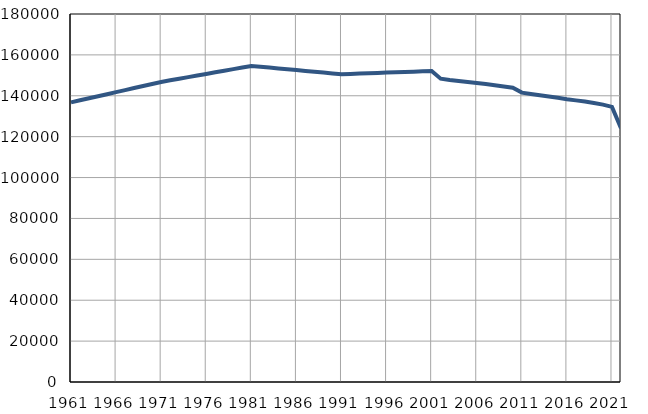
| Category | Population
size |
|---|---|
| 1961.0 | 136782 |
| 1962.0 | 137781 |
| 1963.0 | 138780 |
| 1964.0 | 139778 |
| 1965.0 | 140777 |
| 1966.0 | 141776 |
| 1967.0 | 142775 |
| 1968.0 | 143774 |
| 1969.0 | 144772 |
| 1970.0 | 145771 |
| 1971.0 | 146770 |
| 1972.0 | 147554 |
| 1973.0 | 148338 |
| 1974.0 | 149122 |
| 1975.0 | 149906 |
| 1976.0 | 150690 |
| 1977.0 | 151475 |
| 1978.0 | 152259 |
| 1979.0 | 153043 |
| 1980.0 | 153827 |
| 1981.0 | 154611 |
| 1982.0 | 154204 |
| 1983.0 | 153795 |
| 1984.0 | 153388 |
| 1985.0 | 152980 |
| 1986.0 | 152572 |
| 1987.0 | 152165 |
| 1988.0 | 151757 |
| 1989.0 | 151349 |
| 1990.0 | 150941 |
| 1991.0 | 150534 |
| 1992.0 | 150693 |
| 1993.0 | 150851 |
| 1994.0 | 151010 |
| 1995.0 | 151168 |
| 1996.0 | 151327 |
| 1997.0 | 151484 |
| 1998.0 | 151643 |
| 1999.0 | 151802 |
| 2000.0 | 151961 |
| 2001.0 | 152119 |
| 2002.0 | 148346 |
| 2003.0 | 147700 |
| 2004.0 | 147254 |
| 2005.0 | 146765 |
| 2006.0 | 146238 |
| 2007.0 | 145752 |
| 2008.0 | 145169 |
| 2009.0 | 144540 |
| 2010.0 | 143919 |
| 2011.0 | 141551 |
| 2012.0 | 140847 |
| 2013.0 | 140223 |
| 2014.0 | 139612 |
| 2015.0 | 139011 |
| 2016.0 | 138331 |
| 2017.0 | 137753 |
| 2018.0 | 137173 |
| 2019.0 | 136475 |
| 2020.0 | 135678 |
| 2021.0 | 134572 |
| 2022.0 | 124161 |